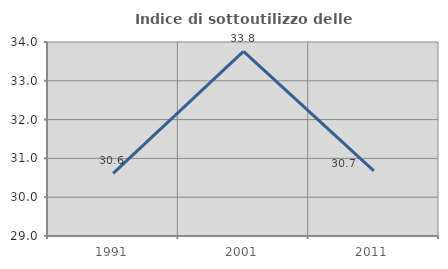
| Category | Indice di sottoutilizzo delle abitazioni  |
|---|---|
| 1991.0 | 30.616 |
| 2001.0 | 33.759 |
| 2011.0 | 30.678 |